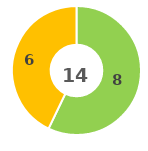
| Category | Series 0 |
|---|---|
| 0 | 0 |
| 1 | 8 |
| 2 | 6 |
| 3 | 0 |
| 4 | 0 |